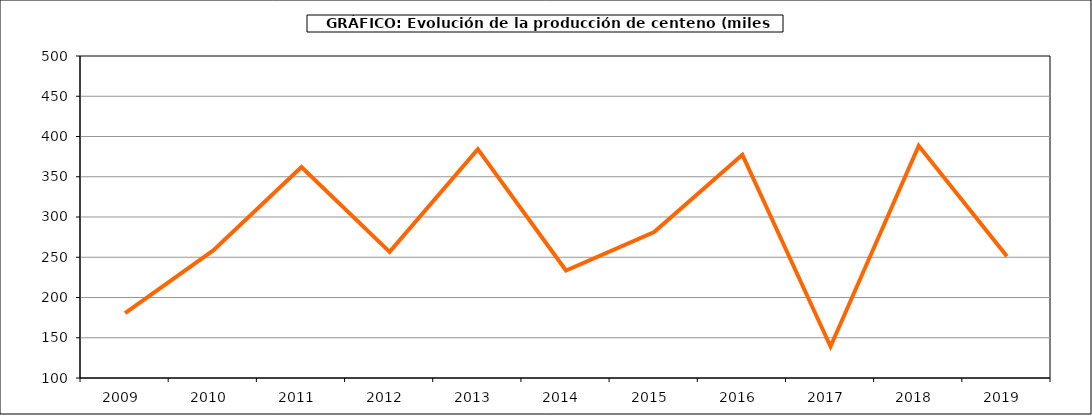
| Category | Producción |
|---|---|
| 2009.0 | 180.666 |
| 2010.0 | 258.38 |
| 2011.0 | 362.08 |
| 2012.0 | 256.675 |
| 2013.0 | 384.339 |
| 2014.0 | 233.542 |
| 2015.0 | 281.366 |
| 2016.0 | 377.355 |
| 2017.0 | 139.178 |
| 2018.0 | 388.467 |
| 2019.0 | 251.324 |